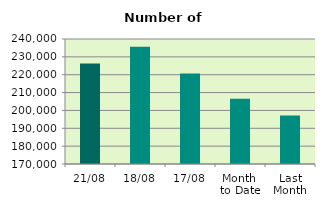
| Category | Series 0 |
|---|---|
| 21/08 | 226274 |
| 18/08 | 235626 |
| 17/08 | 220670 |
| Month 
to Date | 206495.2 |
| Last
Month | 197154 |